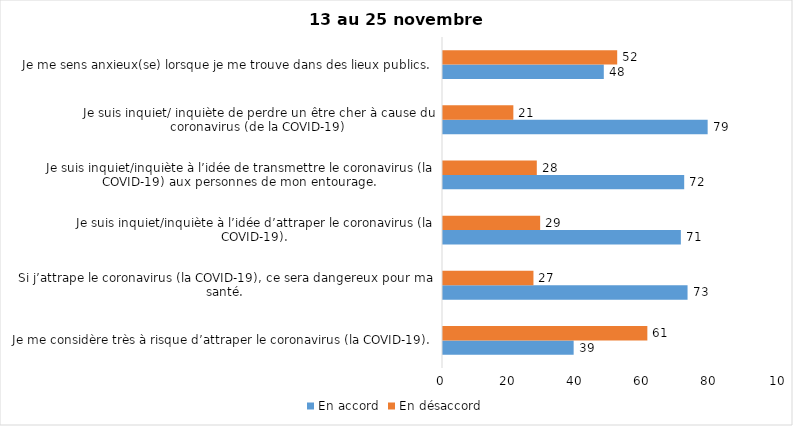
| Category | En accord | En désaccord |
|---|---|---|
| Je me considère très à risque d’attraper le coronavirus (la COVID-19). | 39 | 61 |
| Si j’attrape le coronavirus (la COVID-19), ce sera dangereux pour ma santé. | 73 | 27 |
| Je suis inquiet/inquiète à l’idée d’attraper le coronavirus (la COVID-19). | 71 | 29 |
| Je suis inquiet/inquiète à l’idée de transmettre le coronavirus (la COVID-19) aux personnes de mon entourage. | 72 | 28 |
| Je suis inquiet/ inquiète de perdre un être cher à cause du coronavirus (de la COVID-19) | 79 | 21 |
| Je me sens anxieux(se) lorsque je me trouve dans des lieux publics. | 48 | 52 |